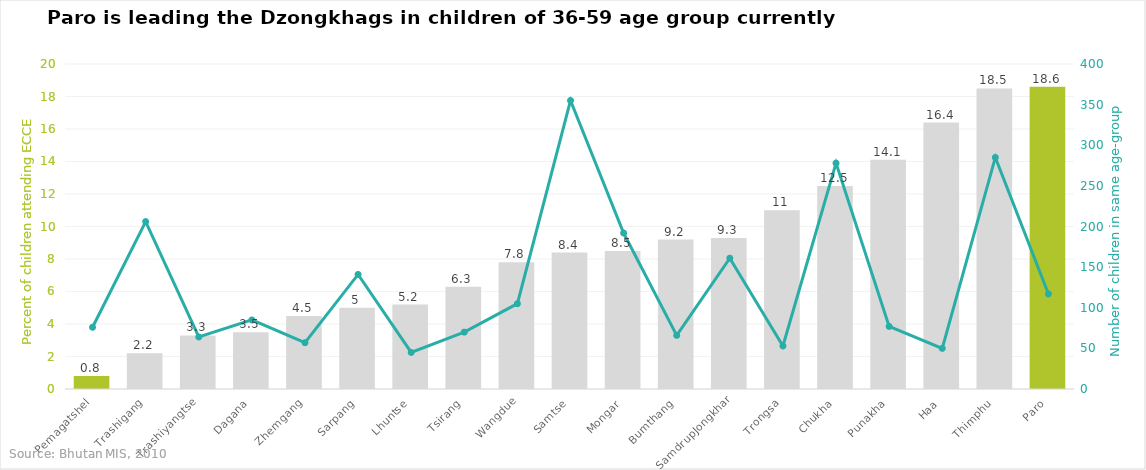
| Category | Children attending early childhood education |
|---|---|
| Pemagatshel | 0.8 |
| Trashigang | 2.2 |
| Trashiyangtse | 3.3 |
| Dagana | 3.5 |
| Zhemgang | 4.5 |
| Sarpang | 5 |
| Lhuntse | 5.2 |
| Tsirang | 6.3 |
| Wangdue | 7.8 |
| Samtse | 8.4 |
| Mongar | 8.5 |
| Bumthang | 9.2 |
| SamdrupJongkhar | 9.3 |
| Trongsa | 11 |
| Chukha | 12.5 |
| Punakha | 14.1 |
| Haa | 16.4 |
| Thimphu | 18.5 |
| Paro | 18.6 |